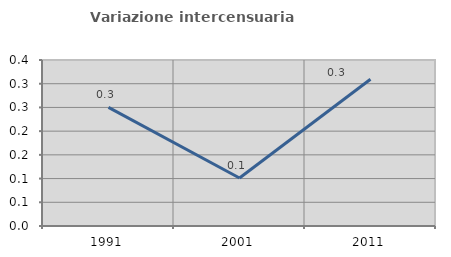
| Category | Variazione intercensuaria annua |
|---|---|
| 1991.0 | 0.25 |
| 2001.0 | 0.101 |
| 2011.0 | 0.309 |